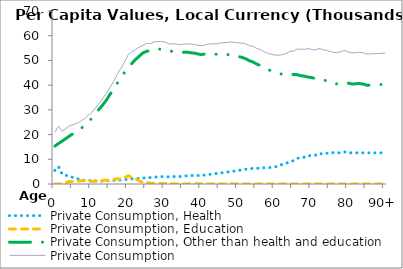
| Category | Private Consumption, Health | Private Consumption, Education | Private Consumption, Other than health and education | Private Consumption |
|---|---|---|---|---|
| 0 | 5510.138 | 0 | 15348.928 | 20859.066 |
|  | 7019.167 | 0 | 16361.105 | 23380.272 |
| 2 | 3947.738 | 0 | 17373.282 | 21321.019 |
| 3 | 3515.821 | 504.576 | 18385.458 | 22405.856 |
| 4 | 3083.905 | 1047.753 | 19397.635 | 23529.294 |
| 5 | 2651.989 | 955.896 | 20409.812 | 24017.697 |
| 6 | 2215.896 | 1044.16 | 21257.202 | 24517.259 |
| 7 | 1705.856 | 1315.084 | 22313.638 | 25334.577 |
| 8 | 1522.833 | 1286.24 | 23518.477 | 26327.55 |
| 9 | 1417.442 | 1305.848 | 24941.365 | 27664.655 |
| 10 | 1274.708 | 1042.274 | 26496.286 | 28813.268 |
| 11 | 1248.078 | 1199.797 | 28263.954 | 30711.829 |
| 12 | 1200.369 | 1105.857 | 30139.113 | 32445.339 |
| 13 | 1180.542 | 1406.461 | 31896.118 | 34483.121 |
| 14 | 1222.898 | 1616.372 | 33846.952 | 36686.222 |
| 15 | 1340.963 | 1394.238 | 36220.834 | 38956.035 |
| 16 | 1425.41 | 1807.363 | 38257.327 | 41490.101 |
| 17 | 1518.748 | 2119.525 | 40752.821 | 44391.094 |
| 18 | 1600.354 | 2011.958 | 43155.191 | 46767.504 |
| 19 | 1765.428 | 2488.886 | 45168.403 | 49422.716 |
| 20 | 2002.351 | 3351.071 | 47030.947 | 52384.368 |
| 21 | 2106.483 | 2602.704 | 48833.658 | 53542.846 |
| 22 | 2106.909 | 1957.897 | 50388.617 | 54453.423 |
| 23 | 2327.923 | 1318.077 | 51762.73 | 55408.73 |
| 24 | 2403.396 | 618.119 | 53024.372 | 56045.887 |
| 25 | 2569.821 | 545.955 | 53709.636 | 56825.412 |
| 26 | 2593.971 | 305.045 | 53904.473 | 56803.489 |
| 27 | 2716.45 | 255.344 | 54484.94 | 57456.734 |
| 28 | 2892.098 | 166.525 | 54589.257 | 57647.88 |
| 29 | 2971.348 | 169.508 | 54548.613 | 57689.47 |
| 30 | 2971.182 | 262.762 | 54226.218 | 57460.161 |
| 31 | 2872.862 | 18.184 | 53883.109 | 56774.155 |
| 32 | 2915.162 | 73.144 | 53685.037 | 56673.344 |
| 33 | 3072.367 | 40.235 | 53598.706 | 56711.308 |
| 34 | 3002.616 | 36.604 | 53316.423 | 56355.643 |
| 35 | 3231.796 | 43.053 | 53277.484 | 56552.332 |
| 36 | 3296.707 | 33.28 | 53371.953 | 56701.94 |
| 37 | 3448.56 | 79.999 | 53069.065 | 56597.625 |
| 38 | 3422.745 | 72.639 | 52988.245 | 56483.629 |
| 39 | 3434.857 | 124.194 | 52576.989 | 56136.04 |
| 40 | 3468.5 | 63.329 | 52375.744 | 55907.573 |
| 41 | 3633.312 | 21.008 | 52634.788 | 56289.109 |
| 42 | 3858.098 | 23.762 | 52800.618 | 56682.479 |
| 43 | 3965.751 | 8.376 | 52677.273 | 56651.4 |
| 44 | 4256.96 | 34.818 | 52496.974 | 56788.751 |
| 45 | 4423.577 | 39.687 | 52544.808 | 57008.072 |
| 46 | 4595.293 | 23.191 | 52544.926 | 57163.41 |
| 47 | 4863.096 | 51.928 | 52336.085 | 57251.109 |
| 48 | 5012.818 | 76.181 | 52444.983 | 57533.982 |
| 49 | 5236.336 | 1.991 | 52000.513 | 57238.839 |
| 50 | 5484.312 | 20.497 | 51605.482 | 57110.29 |
| 51 | 5730.352 | 24.911 | 51228.644 | 56983.906 |
| 52 | 5990.868 | 14.375 | 50687.694 | 56692.937 |
| 53 | 6078.087 | 11.919 | 49884.952 | 55974.958 |
| 54 | 6339.869 | 19.976 | 49365.322 | 55725.166 |
| 55 | 6322.093 | 14.972 | 48520.185 | 54857.25 |
| 56 | 6473.123 | 1.345 | 47961.403 | 54435.87 |
| 57 | 6533.457 | 0.38 | 46987.181 | 53521.018 |
| 58 | 6579.044 | 1.686 | 46343.494 | 52924.223 |
| 59 | 6715.501 | 0 | 45802.727 | 52518.228 |
| 60 | 6945.71 | 0 | 45232.719 | 52178.429 |
| 61 | 7268.508 | 0 | 44852.069 | 52120.576 |
| 62 | 8050.822 | 4.16 | 44284.266 | 52339.248 |
| 63 | 8312.26 | 0 | 44431.279 | 52743.538 |
| 64 | 9092.004 | 5.567 | 44606.169 | 53703.74 |
| 65 | 9401.643 | 0 | 44336.386 | 53738.03 |
| 66 | 10376.062 | 0 | 44243.509 | 54619.571 |
| 67 | 10682.913 | 1.808 | 43830.07 | 54514.791 |
| 68 | 10871.588 | 0 | 43652.381 | 54523.969 |
| 69 | 11521.856 | 0 | 43262.619 | 54784.474 |
| 70 | 11344.862 | 10.871 | 43049.813 | 54405.547 |
| 71 | 11639.043 | 0 | 42626.509 | 54265.551 |
| 72 | 12426.761 | 0 | 42456.969 | 54883.73 |
| 73 | 12064.163 | 0 | 42254.544 | 54318.708 |
| 74 | 12429.566 | 0 | 41713.64 | 54143.206 |
| 75 | 12670.45 | 10.432 | 40921.398 | 53602.28 |
| 76 | 12677.498 | 12.456 | 40556.095 | 53246.049 |
| 77 | 12669.701 | 0 | 40517.528 | 53187.23 |
| 78 | 12563.989 | 0 | 41083.563 | 53647.553 |
| 79 | 12987.772 | 0 | 41031.626 | 54019.398 |
| 80 | 12613.213 | 0 | 40775.841 | 53389.054 |
| 81 | 12613.213 | 0 | 40436.691 | 53049.904 |
| 82 | 12613.213 | 0 | 40555.173 | 53168.386 |
| 83 | 12613.213 | 0 | 40649.993 | 53263.206 |
| 84 | 12613.213 | 25.705 | 40463.934 | 53102.851 |
| 85 | 12613.213 | 0 | 39969.721 | 52582.934 |
| 86 | 12613.213 | 0 | 40040.62 | 52653.832 |
| 87 | 12613.213 | 0 | 40111.518 | 52724.731 |
| 88 | 12613.213 | 0 | 40182.417 | 52795.63 |
| 89 | 12613.213 | 0 | 40253.315 | 52866.528 |
| 90+ | 12613.213 | 0.958 | 40324.214 | 52938.384 |